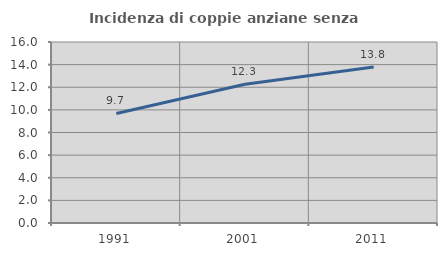
| Category | Incidenza di coppie anziane senza figli  |
|---|---|
| 1991.0 | 9.684 |
| 2001.0 | 12.269 |
| 2011.0 | 13.783 |